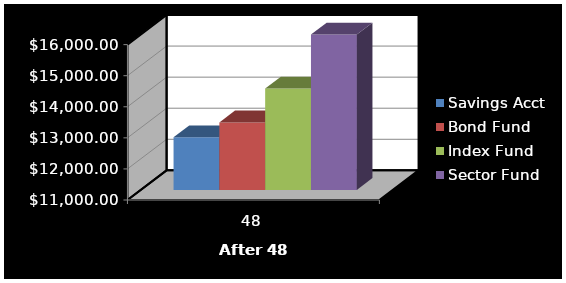
| Category | Savings Acct | Bond Fund | Index Fund | Sector Fund |
|---|---|---|---|---|
| 48.0 | 12695.46 | 13172.593 | 14263.668 | 16429.391 |